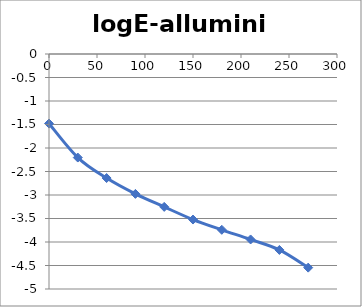
| Category | logE-alluminio |
|---|---|
| 0.0 | -1.48 |
| 30.0 | -2.203 |
| 60.0 | -2.639 |
| 90.0 | -2.976 |
| 120.0 | -3.253 |
| 150.0 | -3.522 |
| 180.0 | -3.741 |
| 210.0 | -3.946 |
| 240.0 | -4.169 |
| 270.0 | -4.545 |